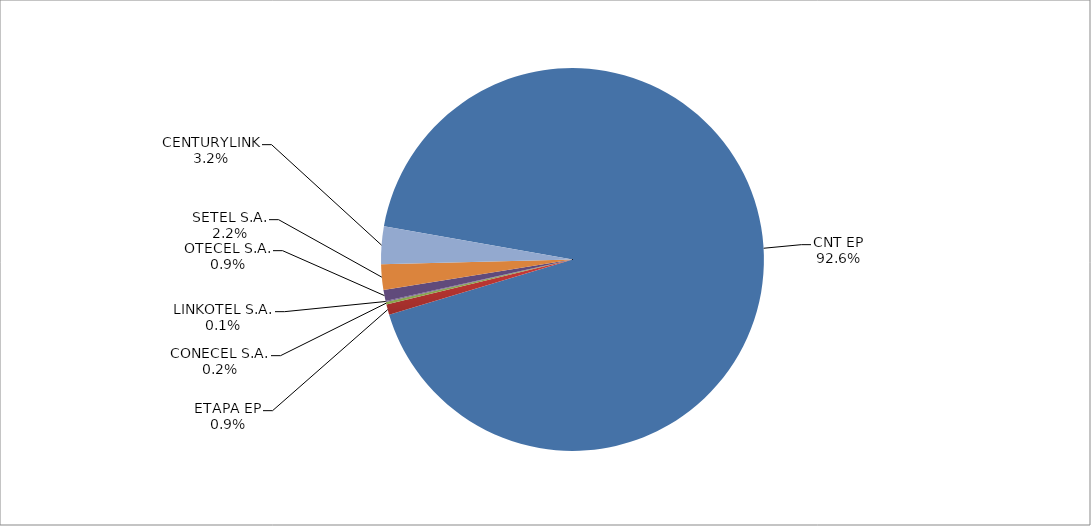
| Category | Series 0 |
|---|---|
| CNT EP | 2779 |
| ETAPA EP | 26 |
| CONECEL S.A. | 7 |
| LINKOTEL S.A. | 2 |
| OTECEL S.A. | 28 |
| SETEL S.A. | 65 |
| CENTURYLINK | 95 |